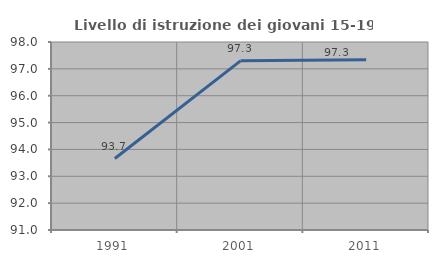
| Category | Livello di istruzione dei giovani 15-19 anni |
|---|---|
| 1991.0 | 93.662 |
| 2001.0 | 97.297 |
| 2011.0 | 97.337 |